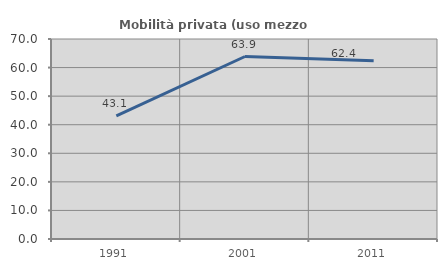
| Category | Mobilità privata (uso mezzo privato) |
|---|---|
| 1991.0 | 43.13 |
| 2001.0 | 63.874 |
| 2011.0 | 62.374 |